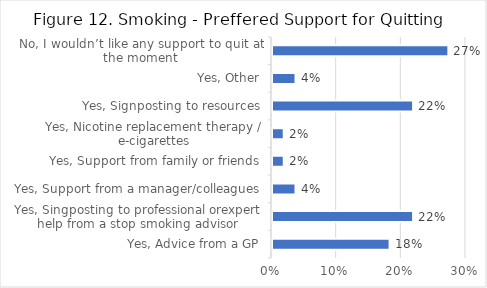
| Category | Series 0 |
|---|---|
| Yes, Advice from a GP | 0.182 |
| Yes, Singposting to professional orexpert help from a stop smoking advisor | 0.218 |
| Yes, Support from a manager/colleagues | 0.036 |
| Yes, Support from family or friends | 0.018 |
| Yes, Nicotine replacement therapy / e-cigarettes | 0.018 |
| Yes, Signposting to resources | 0.218 |
| Yes, Other | 0.036 |
| No, I wouldn’t like any support to quit at the moment | 0.273 |